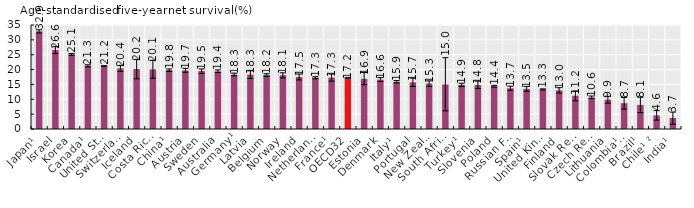
| Category | 2010-2014 |
|---|---|
| Japan¹ | 32.9 |
| Israel | 26.6 |
| Korea | 25.1 |
| Canada¹ | 21.3 |
| United States¹ | 21.2 |
| Switzerland¹ | 20.4 |
| Iceland | 20.2 |
| Costa Rica² | 20.1 |
| China¹ | 19.8 |
| Austria | 19.7 |
| Sweden | 19.5 |
| Australia | 19.4 |
| Germany¹ | 18.3 |
| Latvia | 18.3 |
| Belgium | 18.2 |
| Norway | 18.1 |
| Ireland | 17.5 |
| Netherlands | 17.3 |
| France¹ | 17.3 |
| OECD32 | 17.247 |
| Estonia | 16.9 |
| Denmark | 16.6 |
| Italy¹ | 15.9 |
| Portugal | 15.7 |
| New Zealand | 15.3 |
| South Africa¹ ² | 15 |
| Turkey¹ | 14.9 |
| Slovenia | 14.8 |
| Poland | 14.4 |
| Russian Federation¹ | 13.7 |
| Spain¹ | 13.5 |
| United Kingdom | 13.3 |
| Finland | 13 |
| Slovak Republic | 11.2 |
| Czech Republic | 10.6 |
| Lithuania | 9.9 |
| Colombia¹ ² | 8.7 |
| Brazil¹ | 8.1 |
| Chile¹ ² | 4.6 |
| India¹ | 3.7 |